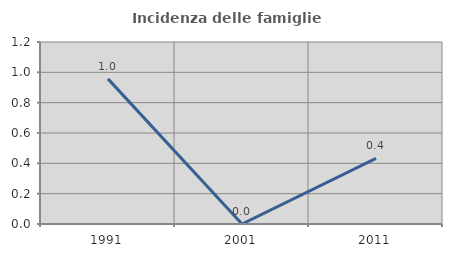
| Category | Incidenza delle famiglie numerose |
|---|---|
| 1991.0 | 0.957 |
| 2001.0 | 0 |
| 2011.0 | 0.433 |